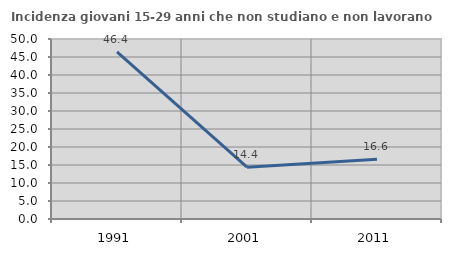
| Category | Incidenza giovani 15-29 anni che non studiano e non lavorano  |
|---|---|
| 1991.0 | 46.429 |
| 2001.0 | 14.407 |
| 2011.0 | 16.607 |